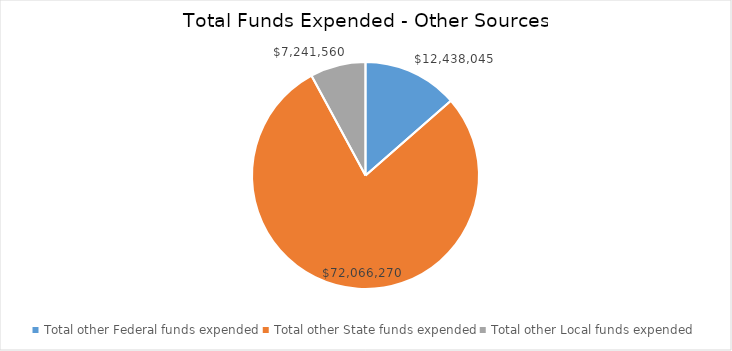
| Category | Series 0 |
|---|---|
| Total other Federal funds expended | 12438044.99 |
| Total other State funds expended | 72066269.99 |
| Total other Local funds expended | 7241559.92 |